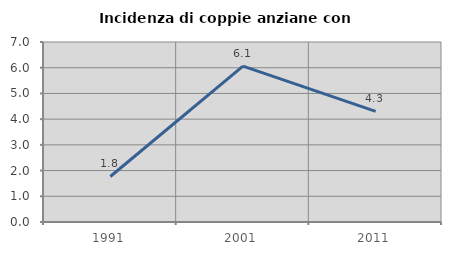
| Category | Incidenza di coppie anziane con figli |
|---|---|
| 1991.0 | 1.77 |
| 2001.0 | 6.061 |
| 2011.0 | 4.301 |